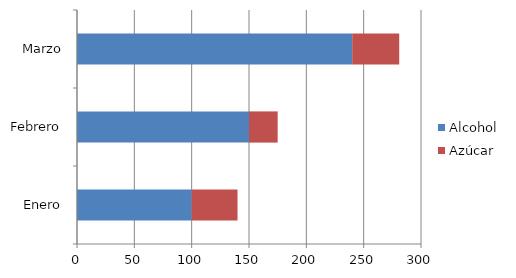
| Category | Alcohol | Azúcar |
|---|---|---|
| Enero | 100 | 40 |
| Febrero | 150 | 25 |
| Marzo | 240 | 41 |